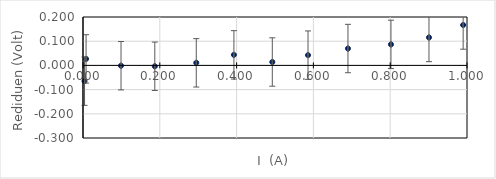
| Category | Residuen  (V) |
|---|---|
| 0.004 | -0.065 |
| 0.008 | 0.027 |
| 0.099 | -0.001 |
| 0.187 | -0.004 |
| 0.295 | 0.011 |
| 0.393 | 0.044 |
| 0.493 | 0.014 |
| 0.586 | 0.042 |
| 0.69 | 0.07 |
| 0.802 | 0.087 |
| 0.901 | 0.115 |
| 0.99 | 0.167 |